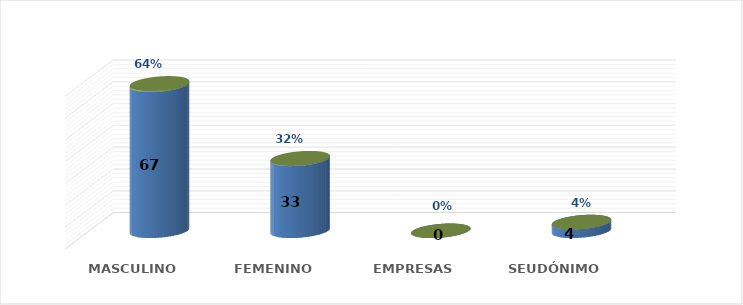
| Category | SOLICITUD POR GÉNERO | Series 1 |
|---|---|---|
| MASCULINO | 67 | 0.644 |
| FEMENINO | 33 | 0.317 |
| EMPRESAS | 0 | 0 |
| SEUDÓNIMO | 4 | 0.038 |